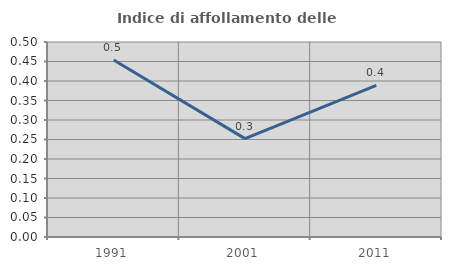
| Category | Indice di affollamento delle abitazioni  |
|---|---|
| 1991.0 | 0.454 |
| 2001.0 | 0.252 |
| 2011.0 | 0.389 |